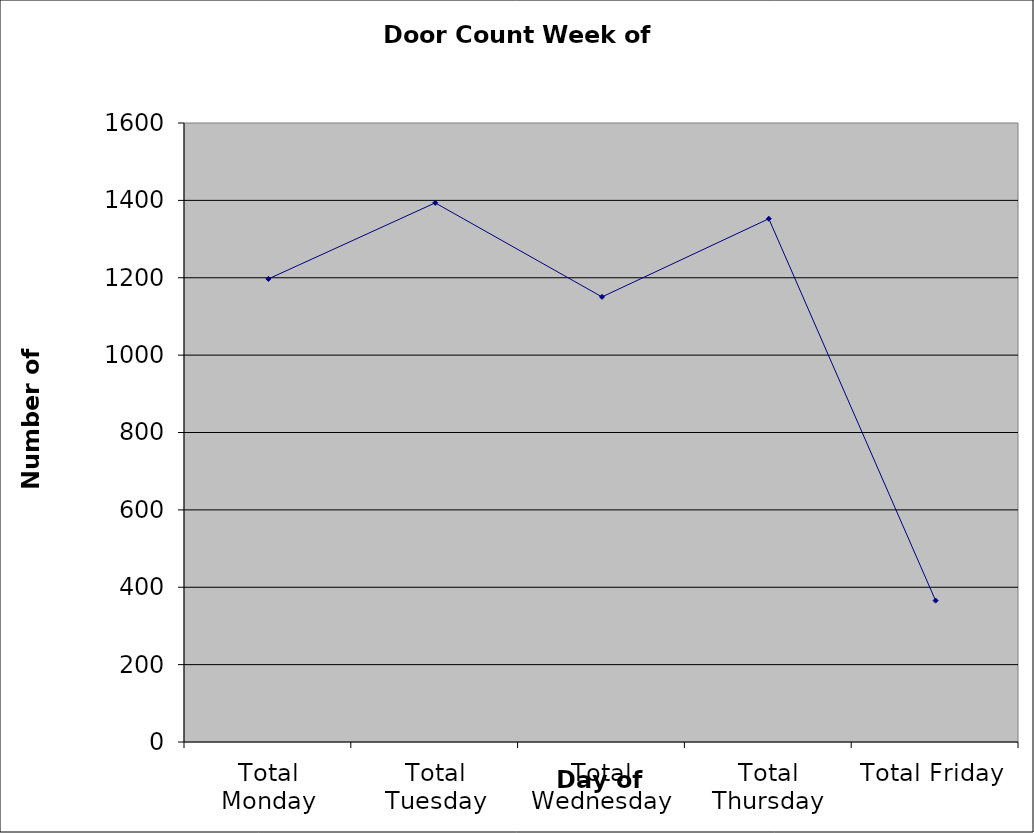
| Category | Series 0 |
|---|---|
| Total Monday | 1197 |
| Total Tuesday | 1393.5 |
| Total Wednesday | 1150.5 |
| Total Thursday | 1352.5 |
| Total Friday | 365.5 |